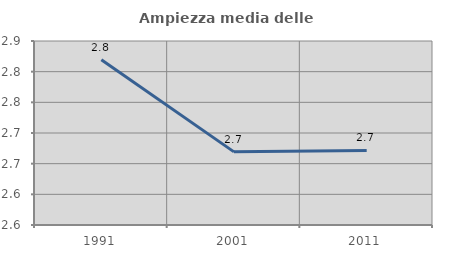
| Category | Ampiezza media delle famiglie |
|---|---|
| 1991.0 | 2.819 |
| 2001.0 | 2.669 |
| 2011.0 | 2.672 |